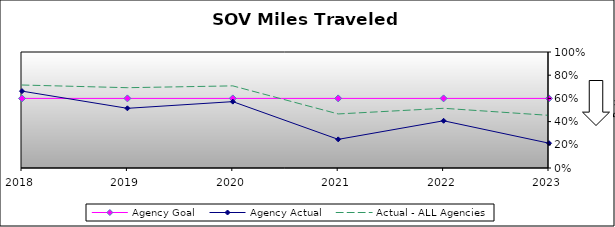
| Category | Agency Goal | Agency Actual | Actual - ALL Agencies |
|---|---|---|---|
| 2018.0 | 0.6 | 0.663 | 0.715 |
| 2019.0 | 0.6 | 0.514 | 0.692 |
| 2020.0 | 0.6 | 0.572 | 0.708 |
| 2021.0 | 0.6 | 0.247 | 0.466 |
| 2022.0 | 0.6 | 0.407 | 0.515 |
| 2023.0 | 0.6 | 0.214 | 0.454 |